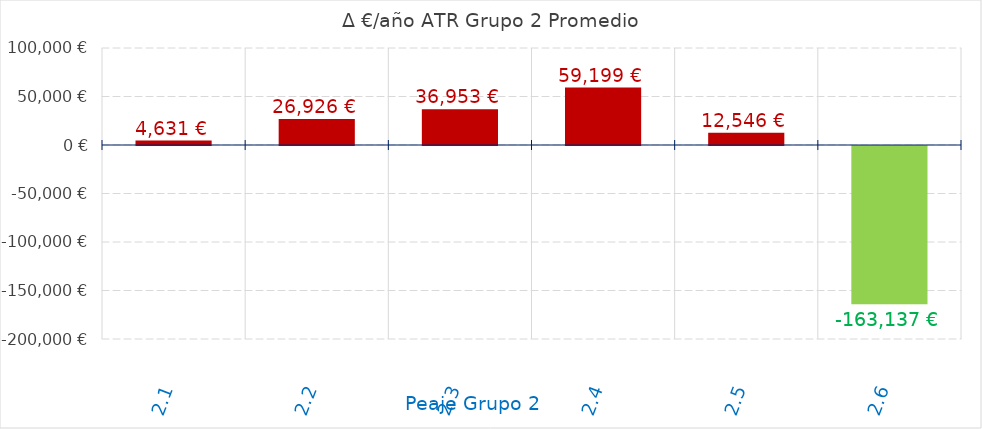
| Category | D €/año |
|---|---|
| 2.1 | 4631.185 |
| 2.2 | 26925.58 |
| 2.3 | 36953.337 |
| 2.4 | 59199.409 |
| 2.5 | 12545.584 |
| 2.6 | -163136.822 |